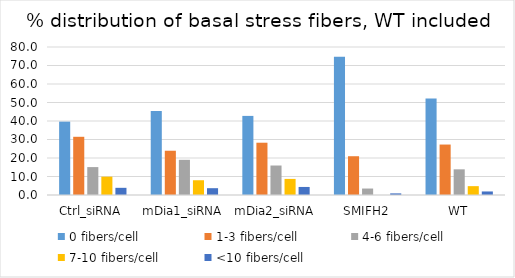
| Category | 0 fibers/cell | 1-3 fibers/cell | 4-6 fibers/cell | 7-10 fibers/cell | <10 fibers/cell |
|---|---|---|---|---|---|
| Ctrl_siRNA | 39.655 | 31.466 | 15.086 | 9.914 | 3.879 |
| mDia1_siRNA | 45.399 | 23.926 | 19.018 | 7.975 | 3.681 |
| mDia2_siRNA | 42.754 | 28.261 | 15.942 | 8.696 | 4.348 |
| SMIFH2 | 74.672 | 20.961 | 3.493 | 0 | 0.873 |
| WT | 52.153 | 27.273 | 13.876 | 4.785 | 1.914 |